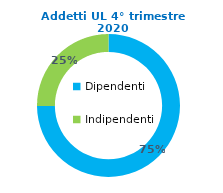
| Category | Series 0 |
|---|---|
| Dipendenti | 67168 |
| Indipendenti | 22537 |